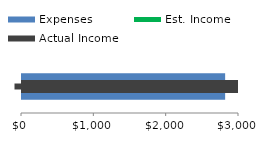
| Category | Expenses |
|---|---|
| Expenses | 2808.5 |